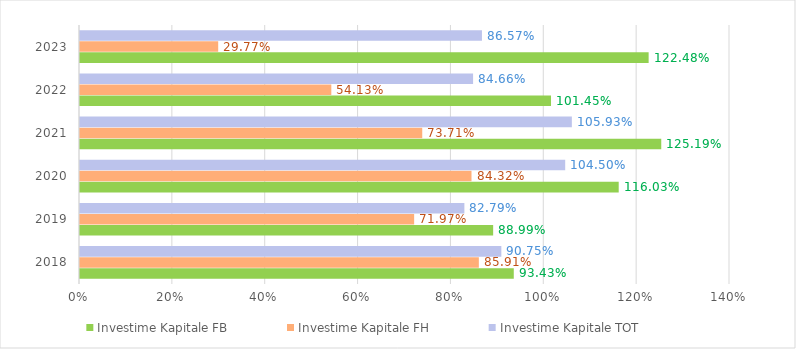
| Category | Investime Kapitale FB | Investime Kapitale FH | Investime Kapitale TOT |
|---|---|---|---|
| 2018.0 | 0.934 | 0.859 | 0.908 |
| 2019.0 | 0.89 | 0.72 | 0.828 |
| 2020.0 | 1.16 | 0.843 | 1.045 |
| 2021.0 | 1.252 | 0.737 | 1.059 |
| 2022.0 | 1.014 | 0.541 | 0.847 |
| 2023.0 | 1.225 | 0.298 | 0.866 |